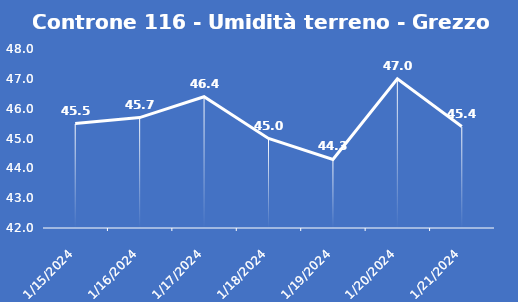
| Category | Controne 116 - Umidità terreno - Grezzo (%VWC) |
|---|---|
| 1/15/24 | 45.5 |
| 1/16/24 | 45.7 |
| 1/17/24 | 46.4 |
| 1/18/24 | 45 |
| 1/19/24 | 44.3 |
| 1/20/24 | 47 |
| 1/21/24 | 45.4 |